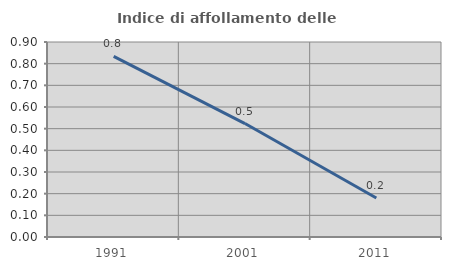
| Category | Indice di affollamento delle abitazioni  |
|---|---|
| 1991.0 | 0.833 |
| 2001.0 | 0.524 |
| 2011.0 | 0.18 |